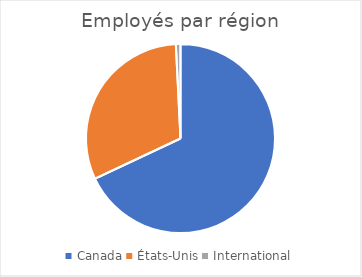
| Category | Series 0 |
|---|---|
| Canada | 62471 |
| États-Unis | 28675 |
| International | 722 |